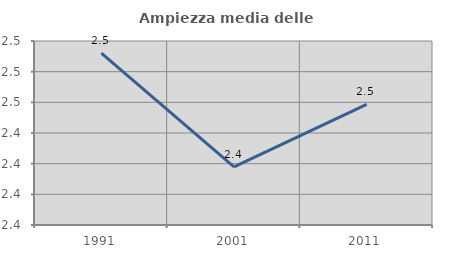
| Category | Ampiezza media delle famiglie |
|---|---|
| 1991.0 | 2.492 |
| 2001.0 | 2.418 |
| 2011.0 | 2.459 |